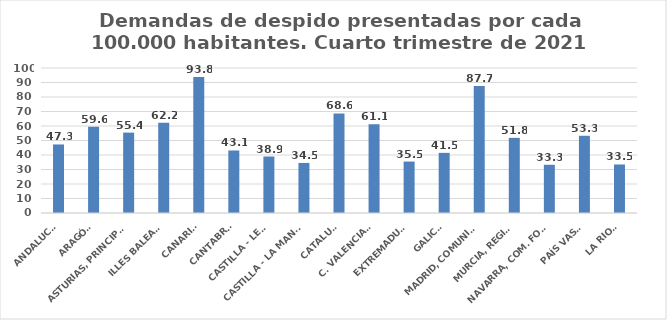
| Category | Series 0 |
|---|---|
| ANDALUCÍA | 47.28 |
| ARAGÓN | 59.566 |
| ASTURIAS, PRINCIPADO | 55.446 |
| ILLES BALEARS | 62.233 |
| CANARIAS | 93.79 |
| CANTABRIA | 43.113 |
| CASTILLA - LEÓN | 38.94 |
| CASTILLA - LA MANCHA | 34.544 |
| CATALUÑA | 68.643 |
| C. VALENCIANA | 61.129 |
| EXTREMADURA | 35.488 |
| GALICIA | 41.474 |
| MADRID, COMUNIDAD | 87.658 |
| MURCIA, REGIÓN | 51.828 |
| NAVARRA, COM. FORAL | 33.256 |
| PAÍS VASCO | 53.252 |
| LA RIOJA | 33.459 |